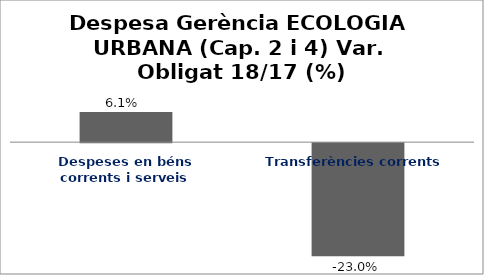
| Category | Series 0 |
|---|---|
| Despeses en béns corrents i serveis | 0.061 |
| Transferències corrents | -0.23 |